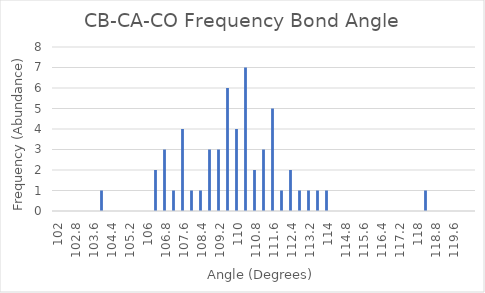
| Category | Series 0 |
|---|---|
| 102.0 | 0 |
| 102.4 | 0 |
| 102.80000000000001 | 0 |
| 103.20000000000002 | 0 |
| 103.60000000000002 | 0 |
| 104.00000000000003 | 1 |
| 104.40000000000003 | 0 |
| 104.80000000000004 | 0 |
| 105.20000000000005 | 0 |
| 105.60000000000005 | 0 |
| 106.00000000000006 | 0 |
| 106.40000000000006 | 2 |
| 106.80000000000007 | 3 |
| 107.20000000000007 | 1 |
| 107.60000000000008 | 4 |
| 108.00000000000009 | 1 |
| 108.40000000000009 | 1 |
| 108.8000000000001 | 3 |
| 109.2000000000001 | 3 |
| 109.60000000000011 | 6 |
| 110.00000000000011 | 4 |
| 110.40000000000012 | 7 |
| 110.80000000000013 | 2 |
| 111.20000000000013 | 3 |
| 111.60000000000014 | 5 |
| 112.00000000000014 | 1 |
| 112.40000000000015 | 2 |
| 112.80000000000015 | 1 |
| 113.20000000000016 | 1 |
| 113.60000000000016 | 1 |
| 114.00000000000017 | 1 |
| 114.40000000000018 | 0 |
| 114.80000000000018 | 0 |
| 115.20000000000019 | 0 |
| 115.6000000000002 | 0 |
| 116.0000000000002 | 0 |
| 116.4000000000002 | 0 |
| 116.80000000000021 | 0 |
| 117.20000000000022 | 0 |
| 117.60000000000022 | 0 |
| 118.00000000000023 | 0 |
| 118.40000000000023 | 1 |
| 118.80000000000024 | 0 |
| 119.20000000000024 | 0 |
| 119.60000000000025 | 0 |
| 120.00000000000026 | 0 |